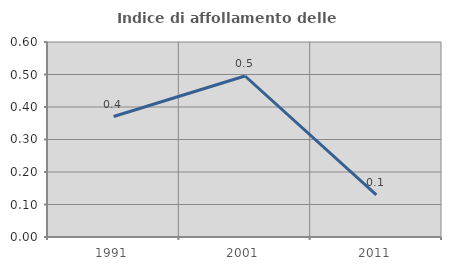
| Category | Indice di affollamento delle abitazioni  |
|---|---|
| 1991.0 | 0.371 |
| 2001.0 | 0.495 |
| 2011.0 | 0.13 |